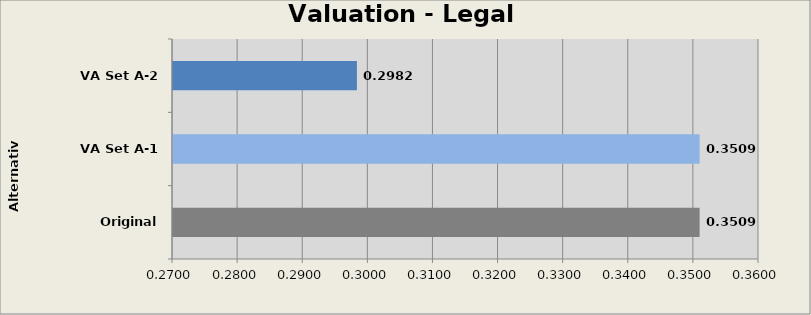
| Category | Legal Module |
|---|---|
| Original A-0 | 0.351 |
| VA Set A-1 | 0.351 |
| VA Set A-2 | 0.298 |